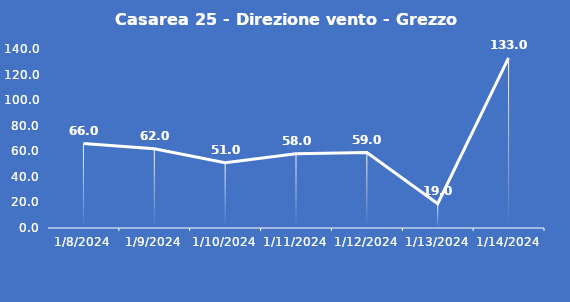
| Category | Casarea 25 - Direzione vento - Grezzo (°N) |
|---|---|
| 1/8/24 | 66 |
| 1/9/24 | 62 |
| 1/10/24 | 51 |
| 1/11/24 | 58 |
| 1/12/24 | 59 |
| 1/13/24 | 19 |
| 1/14/24 | 133 |